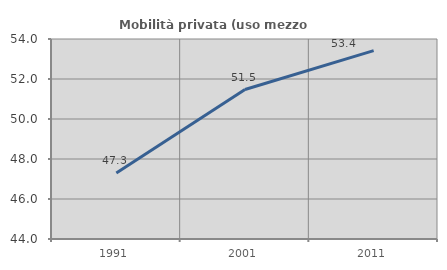
| Category | Mobilità privata (uso mezzo privato) |
|---|---|
| 1991.0 | 47.298 |
| 2001.0 | 51.475 |
| 2011.0 | 53.422 |